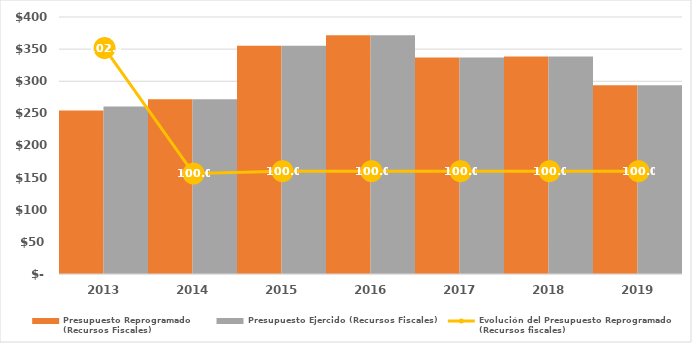
| Category | Presupuesto Reprogramado
(Recursos Fiscales) | Presupuesto Ejercido (Recursos Fiscales) |
|---|---|---|
| 2013.0 | 254564.7 | 260665.1 |
| 2014.0 | 271990.9 | 271865.4 |
| 2015.0 | 355160.2 | 355160.2 |
| 2016.0 | 371403.9 | 371403.9 |
| 2017.0 | 337092.5 | 337092.5 |
| 2018.0 | 338675 | 338675 |
| 2019.0 | 293830.853 | 293830.853 |